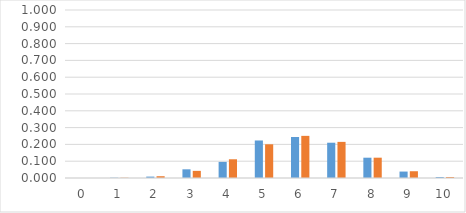
| Category | felfreq | prob |
|---|---|---|
| 0.0 | 0 | 0 |
| 1.0 | 0.002 | 0.002 |
| 2.0 | 0.008 | 0.011 |
| 3.0 | 0.052 | 0.042 |
| 4.0 | 0.096 | 0.111 |
| 5.0 | 0.223 | 0.201 |
| 6.0 | 0.244 | 0.251 |
| 7.0 | 0.21 | 0.215 |
| 8.0 | 0.121 | 0.121 |
| 9.0 | 0.038 | 0.04 |
| 10.0 | 0.006 | 0.006 |